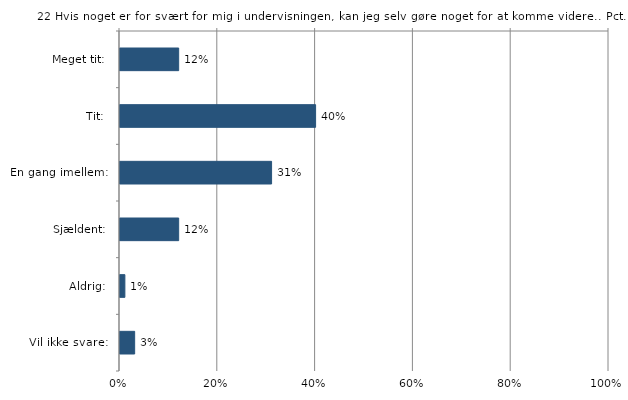
| Category | Hvis noget er for svært for mig i undervisningen, kan jeg selv gøre noget for at komme videre. |
|---|---|
| Meget tit:  | 0.12 |
| Tit:  | 0.4 |
| En gang imellem:  | 0.31 |
| Sjældent:  | 0.12 |
| Aldrig:  | 0.01 |
| Vil ikke svare:  | 0.03 |